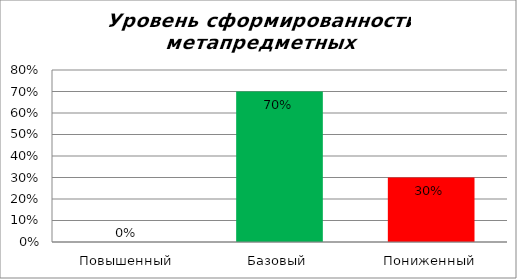
| Category | Уровень сформированности метапредметных результатов |
|---|---|
| Повышенный | 0 |
| Базовый | 0.7 |
| Пониженный | 0.3 |